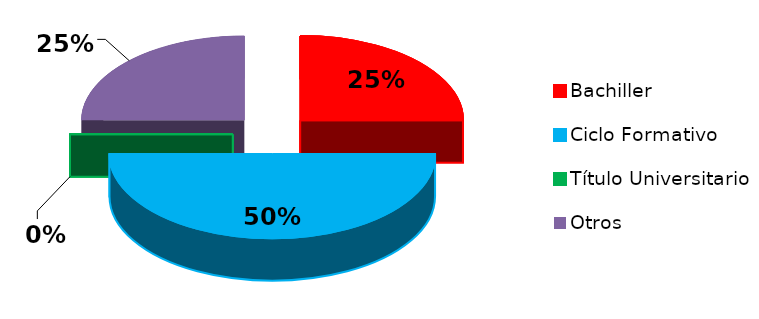
| Category | Series 0 |
|---|---|
| Bachiller | 1 |
| Ciclo Formativo | 2 |
| Título Universitario | 0 |
| Otros | 1 |